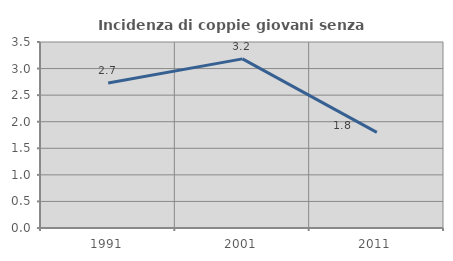
| Category | Incidenza di coppie giovani senza figli |
|---|---|
| 1991.0 | 2.727 |
| 2001.0 | 3.183 |
| 2011.0 | 1.799 |